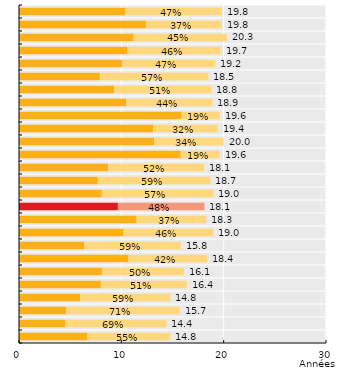
| Category | Années de vie en bonne santé | Espérance de vie avec limitation de l'activité | Series 0 |
|---|---|---|---|
| 0.47474747474747475 | 10.4 | 9.4 | 19.8 |
| 0.37373737373737376 | 12.4 | 7.4 | 19.8 |
| 0.4482758620689656 | 11.2 | 9.1 | 20.3 |
| 0.4619289340101523 | 10.6 | 9.1 | 19.7 |
| 0.4739583333333333 | 10.1 | 9.1 | 19.2 |
| 0.572972972972973 | 7.9 | 10.6 | 18.5 |
| 0.5053191489361702 | 9.3 | 9.5 | 18.8 |
| 0.4444444444444444 | 10.5 | 8.4 | 18.9 |
| 0.18877551020408168 | 15.9 | 3.7 | 19.6 |
| 0.32474226804123707 | 13.1 | 6.3 | 19.4 |
| 0.34 | 13.2 | 6.8 | 20 |
| 0.19387755102040818 | 15.8 | 3.8 | 19.6 |
| 0.5193370165745858 | 8.7 | 9.4 | 18.1 |
| 0.5882352941176471 | 7.7 | 11 | 18.7 |
| 0.5736842105263158 | 8.1 | 10.9 | 19 |
| 0.47510727007454534 | 9.664 | 8.46 | 18.124 |
| 0.37158469945355194 | 11.5 | 6.8 | 18.3 |
| 0.46315789473684216 | 10.2 | 8.8 | 19 |
| 0.5949367088607594 | 6.4 | 9.4 | 15.8 |
| 0.4184782608695652 | 10.7 | 7.7 | 18.4 |
| 0.49689440993788825 | 8.1 | 8 | 16.1 |
| 0.5121951219512195 | 8 | 8.4 | 16.4 |
| 0.5945945945945946 | 6 | 8.8 | 14.8 |
| 0.7070063694267515 | 4.6 | 11.1 | 15.7 |
| 0.6875 | 4.5 | 9.9 | 14.4 |
| 0.5472972972972974 | 6.7 | 8.1 | 14.8 |